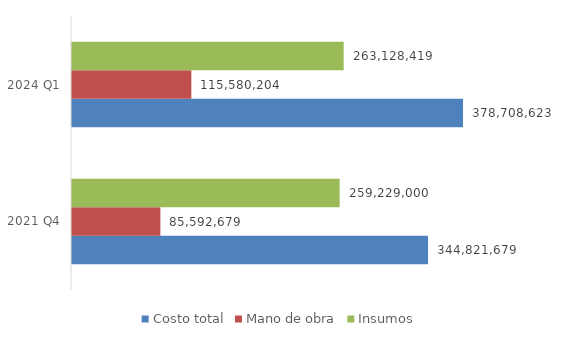
| Category | Costo total | Mano de obra | Insumos |
|---|---|---|---|
| 2021 Q4 | 344821678.571 | 85592678.571 | 259229000 |
| 2024 Q1 | 378708622.651 | 115580203.786 | 263128418.866 |